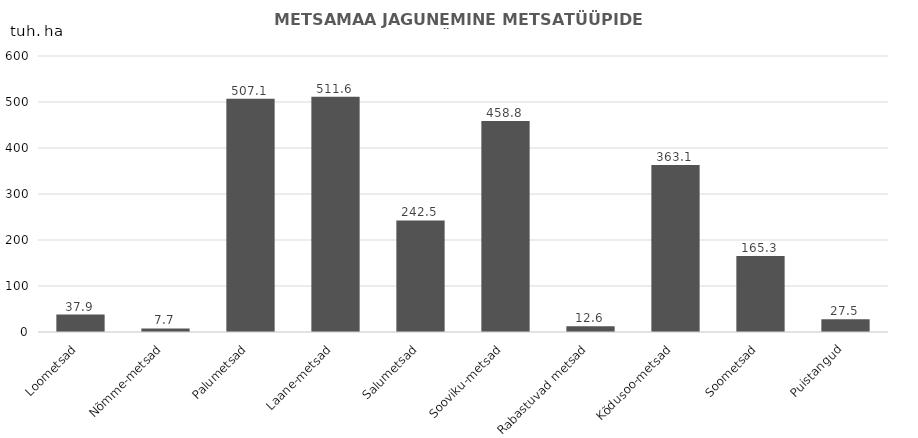
| Category | Series 0 |
|---|---|
| Loometsad | 37.865 |
| Nõmme-metsad | 7.702 |
| Palumetsad | 507.14 |
| Laane-metsad | 511.585 |
| Salumetsad | 242.509 |
| Sooviku-metsad | 458.817 |
| Rabastuvad metsad | 12.637 |
| Kõdusoo-metsad | 363.101 |
| Soometsad | 165.326 |
| Puistangud | 27.495 |